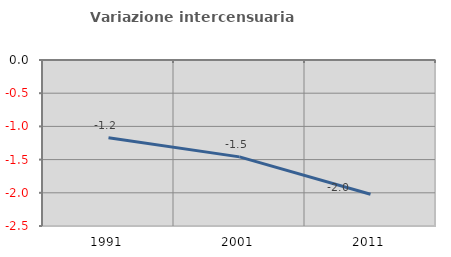
| Category | Variazione intercensuaria annua |
|---|---|
| 1991.0 | -1.171 |
| 2001.0 | -1.459 |
| 2011.0 | -2.022 |